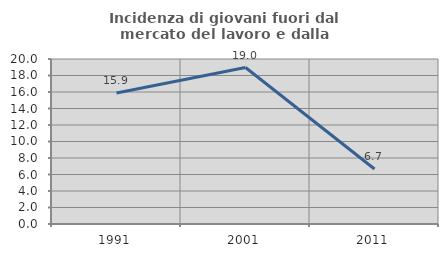
| Category | Incidenza di giovani fuori dal mercato del lavoro e dalla formazione  |
|---|---|
| 1991.0 | 15.873 |
| 2001.0 | 18.966 |
| 2011.0 | 6.667 |